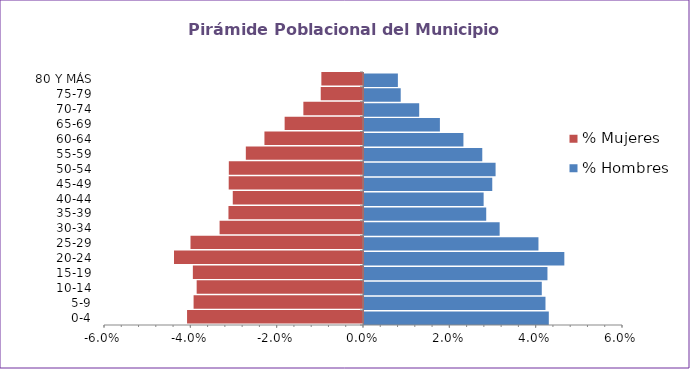
| Category | % Hombres | % Mujeres |
|---|---|---|
| 0-4 | 0.043 | -0.041 |
| 5-9 | 0.042 | -0.039 |
| 10-14 | 0.041 | -0.039 |
| 15-19 | 0.042 | -0.039 |
| 20-24 | 0.046 | -0.044 |
| 25-29 | 0.04 | -0.04 |
| 30-34 | 0.031 | -0.033 |
| 35-39 | 0.028 | -0.031 |
| 40-44 | 0.028 | -0.03 |
| 45-49 | 0.03 | -0.031 |
| 50-54 | 0.03 | -0.031 |
| 55-59 | 0.027 | -0.027 |
| 60-64 | 0.023 | -0.023 |
| 65-69 | 0.018 | -0.018 |
| 70-74 | 0.013 | -0.014 |
| 75-79 | 0.009 | -0.01 |
| 80 Y MÁS | 0.008 | -0.01 |